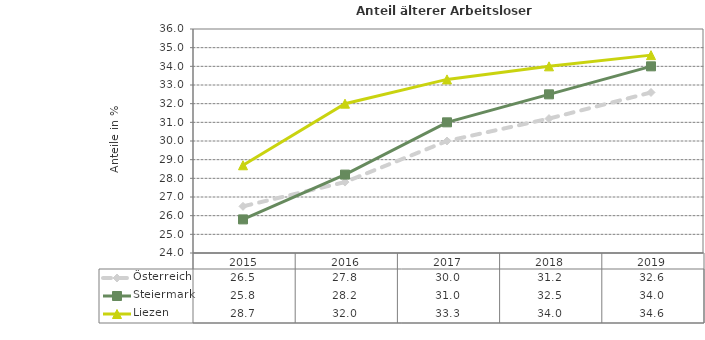
| Category | Österreich | Steiermark | Liezen |
|---|---|---|---|
| 2019.0 | 32.6 | 34 | 34.6 |
| 2018.0 | 31.2 | 32.5 | 34 |
| 2017.0 | 30 | 31 | 33.3 |
| 2016.0 | 27.8 | 28.2 | 32 |
| 2015.0 | 26.5 | 25.8 | 28.7 |